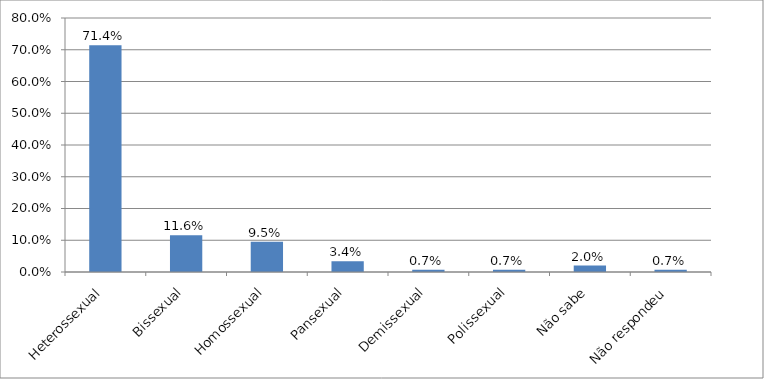
| Category | Series 0 |
|---|---|
| Heterossexual | 0.714 |
| Bissexual | 0.116 |
| Homossexual | 0.095 |
| Pansexual | 0.034 |
| Demissexual | 0.007 |
| Polissexual | 0.007 |
| Não sabe | 0.02 |
| Não respondeu | 0.007 |